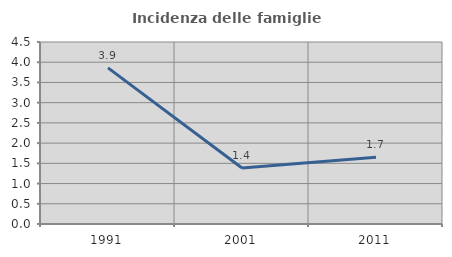
| Category | Incidenza delle famiglie numerose |
|---|---|
| 1991.0 | 3.861 |
| 2001.0 | 1.384 |
| 2011.0 | 1.653 |